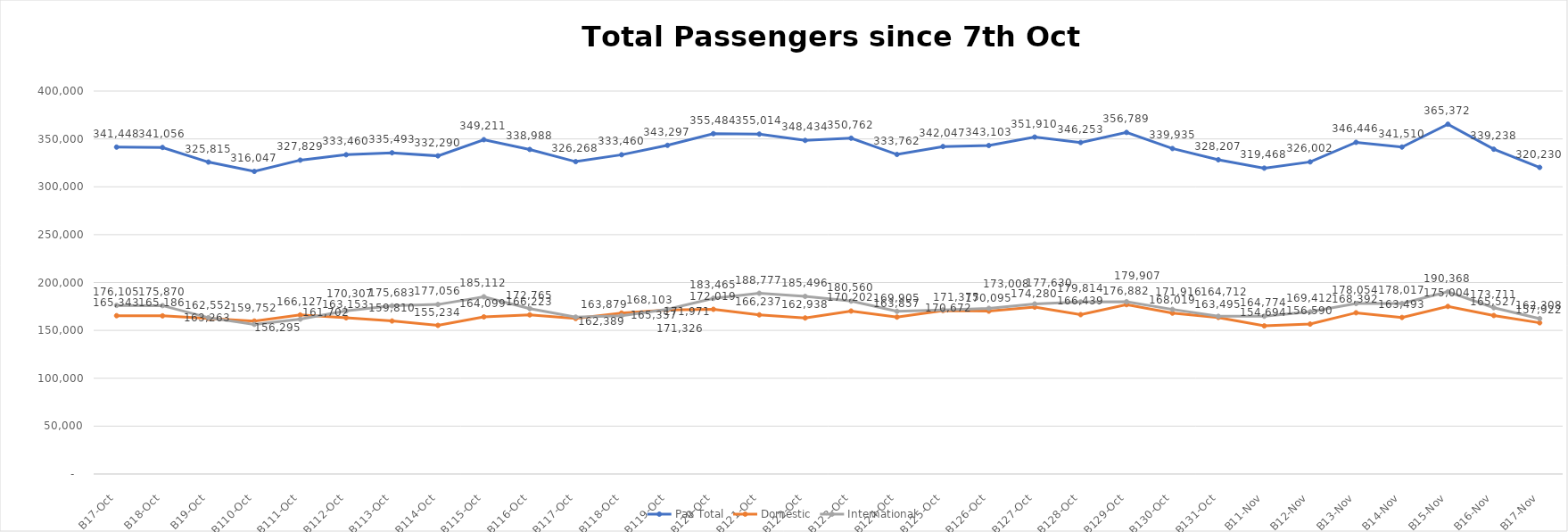
| Category | Pax Total | Domestic | International |
|---|---|---|---|
| 2023-10-07 | 341448 | 165343 | 176105 |
| 2023-10-08 | 341056 | 165186 | 175870 |
| 2023-10-09 | 325815 | 162552 | 163263 |
| 2023-10-10 | 316047 | 159752 | 156295 |
| 2023-10-11 | 327829 | 166127 | 161702 |
| 2023-10-12 | 333460 | 163153 | 170307 |
| 2023-10-13 | 335493 | 159810 | 175683 |
| 2023-10-14 | 332290 | 155234 | 177056 |
| 2023-10-15 | 349211 | 164099 | 185112 |
| 2023-10-16 | 338988 | 166223 | 172765 |
| 2023-10-17 | 326268 | 162389 | 163879 |
| 2023-10-18 | 333460 | 168103 | 165357 |
| 2023-10-19 | 343297 | 171326 | 171971 |
| 2023-10-20 | 355484 | 172019 | 183465 |
| 2023-10-21 | 355014 | 166237 | 188777 |
| 2023-10-22 | 348434 | 162938 | 185496 |
| 2023-10-23 | 350762 | 170202 | 180560 |
| 2023-10-24 | 333762 | 163857 | 169905 |
| 2023-10-25 | 342047 | 170672 | 171375 |
| 2023-10-26 | 343103 | 170095 | 173008 |
| 2023-10-27 | 351910 | 174280 | 177630 |
| 2023-10-28 | 346253 | 166439 | 179814 |
| 2023-10-29 | 356789 | 176882 | 179907 |
| 2023-10-30 | 339935 | 168019 | 171916 |
| 2023-10-31 | 328207 | 163495 | 164712 |
| 2023-11-01 | 319468 | 154694 | 164774 |
| 2023-11-02 | 326002 | 156590 | 169412 |
| 2023-11-03 | 346446 | 168392 | 178054 |
| 2023-11-04 | 341510 | 163493 | 178017 |
| 2023-11-05 | 365372 | 175004 | 190368 |
| 2023-11-06 | 339238 | 165527 | 173711 |
| 2023-11-07 | 320230 | 157922 | 162308 |